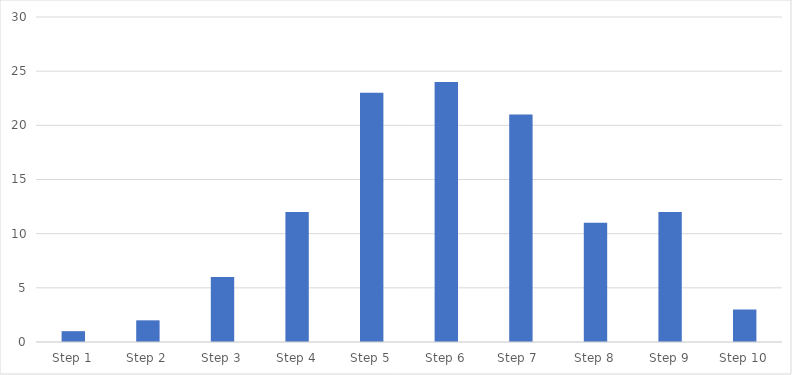
| Category | Number of Responses |
|---|---|
| Step 1 | 1 |
| Step 2 | 2 |
| Step 3 | 6 |
| Step 4 | 12 |
| Step 5 | 23 |
| Step 6 | 24 |
| Step 7  | 21 |
| Step 8 | 11 |
| Step 9 | 12 |
| Step 10 | 3 |